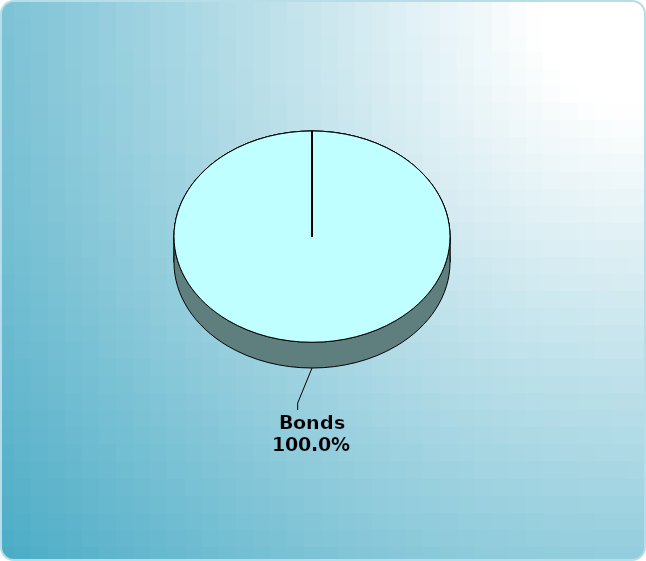
| Category | Series 0 |
|---|---|
| Cash | 0 |
| Bonds | 4000 |
| Muni Bond | 0 |
| Hybrid bond | 0 |
| Value | 0 |
| Growth | 0 |
| Small-Cap | 0 |
| Tangibles | 0 |
| International | 0 |
| Personal Property | 0 |
| Miscellaneous | 0 |